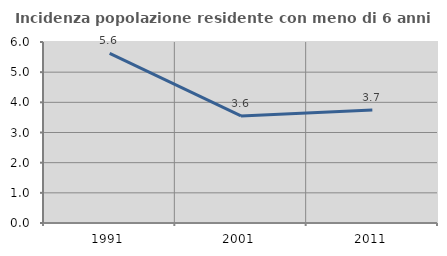
| Category | Incidenza popolazione residente con meno di 6 anni |
|---|---|
| 1991.0 | 5.624 |
| 2001.0 | 3.551 |
| 2011.0 | 3.743 |